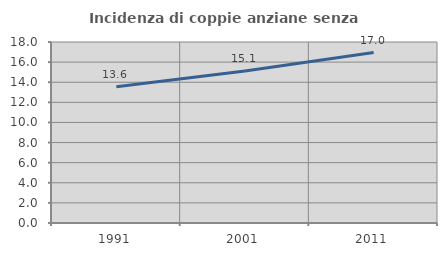
| Category | Incidenza di coppie anziane senza figli  |
|---|---|
| 1991.0 | 13.56 |
| 2001.0 | 15.126 |
| 2011.0 | 16.952 |